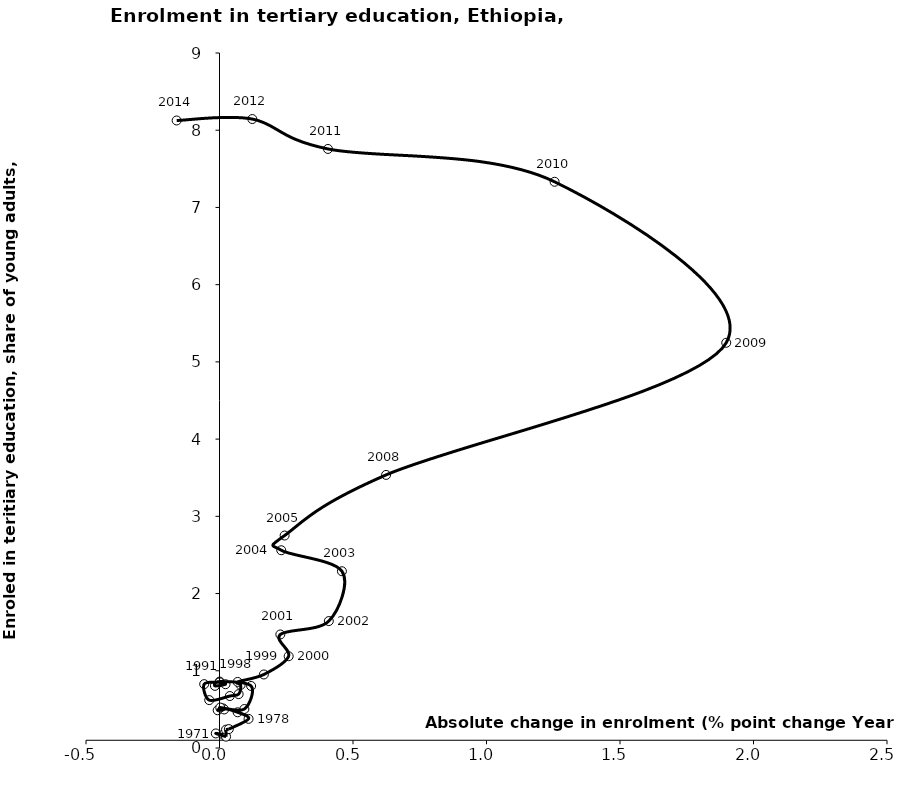
| Category | Series 0 |
|---|---|
| 0.013799995183944008 | 0.175 |
| -0.013894997537136494 | 0.189 |
| 0.024510003626347004 | 0.147 |
| 0.024422500282526245 | 0.238 |
| 0.034915000200271495 | 0.245 |
| 0.1088350042700765 | 0.377 |
| 0.06783001124858848 | 0.462 |
| 0.012934997677803012 | 0.513 |
| -0.006790012121200478 | 0.488 |
| 0.017590001225471497 | 0.499 |
| 0.0027549862861635244 | 0.523 |
| 0.09320666392644265 | 0.505 |
| 0.11840001742045066 | 0.803 |
| 0.00075501203536954 | 0.86 |
| -0.01714000105857849 | 0.805 |
| 0.0225649774074555 | 0.826 |
| 0.0005849897861479603 | 0.85 |
| -0.05737249553203577 | 0.827 |
| -0.03851500153541548 | 0.62 |
| 0.03866499662399303 | 0.673 |
| 0.07166001200675948 | 0.698 |
| 0.0791000127792355 | 0.816 |
| 0.06792497634887701 | 0.856 |
| 0.16616499423980552 | 0.952 |
| 0.259034991264344 | 1.188 |
| 0.22782498598099 | 1.47 |
| 0.40943497419357 | 1.644 |
| 0.4585150480270399 | 2.289 |
| 0.23127007484436501 | 2.561 |
| 0.24393248558044256 | 2.752 |
| 0.6239399313926676 | 3.537 |
| 1.8978800773620599 | 5.247 |
| 1.255025148391725 | 7.332 |
| 0.40621972084045543 | 7.757 |
| 0.12287012736002634 | 8.145 |
| -0.16047946612040276 | 8.126 |